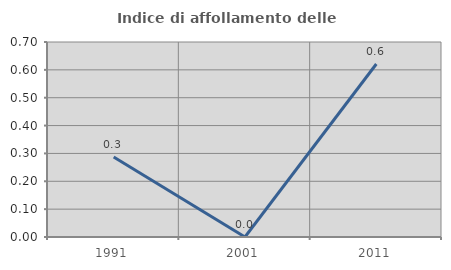
| Category | Indice di affollamento delle abitazioni  |
|---|---|
| 1991.0 | 0.287 |
| 2001.0 | 0 |
| 2011.0 | 0.621 |